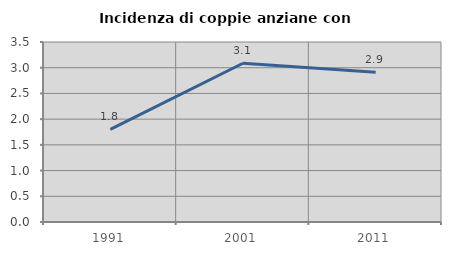
| Category | Incidenza di coppie anziane con figli |
|---|---|
| 1991.0 | 1.801 |
| 2001.0 | 3.086 |
| 2011.0 | 2.913 |